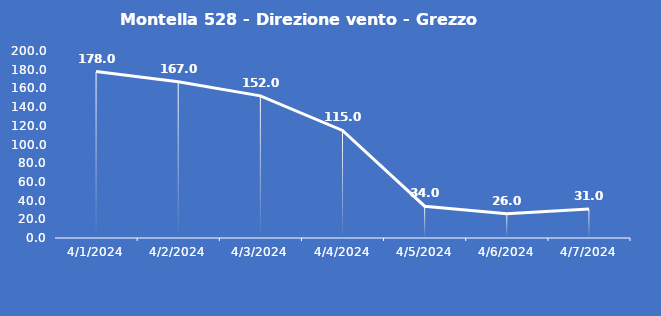
| Category | Montella 528 - Direzione vento - Grezzo (°N) |
|---|---|
| 4/1/24 | 178 |
| 4/2/24 | 167 |
| 4/3/24 | 152 |
| 4/4/24 | 115 |
| 4/5/24 | 34 |
| 4/6/24 | 26 |
| 4/7/24 | 31 |